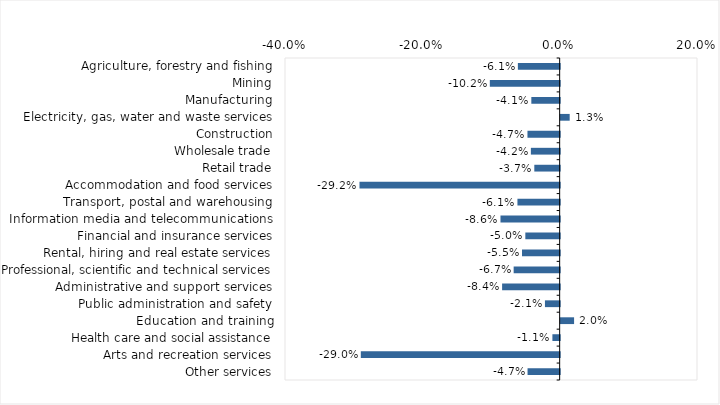
| Category | This week |
|---|---|
| Agriculture, forestry and fishing | -0.061 |
| Mining | -0.102 |
| Manufacturing | -0.041 |
| Electricity, gas, water and waste services | 0.013 |
| Construction | -0.047 |
| Wholesale trade | -0.042 |
| Retail trade | -0.037 |
| Accommodation and food services | -0.292 |
| Transport, postal and warehousing | -0.061 |
| Information media and telecommunications | -0.086 |
| Financial and insurance services | -0.05 |
| Rental, hiring and real estate services | -0.055 |
| Professional, scientific and technical services | -0.067 |
| Administrative and support services | -0.084 |
| Public administration and safety | -0.021 |
| Education and training | 0.02 |
| Health care and social assistance | -0.011 |
| Arts and recreation services | -0.29 |
| Other services | -0.047 |